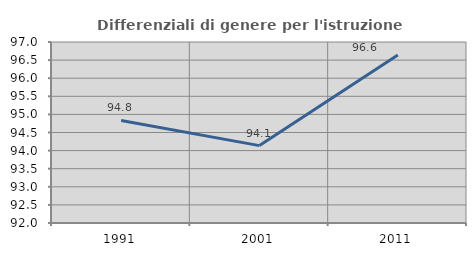
| Category | Differenziali di genere per l'istruzione superiore |
|---|---|
| 1991.0 | 94.832 |
| 2001.0 | 94.138 |
| 2011.0 | 96.642 |